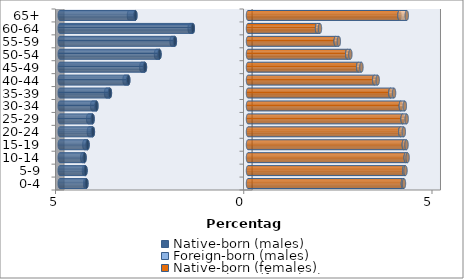
| Category | Native-born (males) | Foreign-born (males) | Native-born (females) | Foreign-born (females) |
|---|---|---|---|---|
| 0-4 | -4.292 | -0.033 | 4.115 | 0.028 |
| 5-9 | -4.316 | -0.041 | 4.15 | 0.033 |
| 10-14 | -4.342 | -0.061 | 4.189 | 0.05 |
| 15-19 | -4.262 | -0.085 | 4.139 | 0.071 |
| 20-24 | -4.12 | -0.106 | 4.045 | 0.094 |
| 25-29 | -4.128 | -0.118 | 4.107 | 0.108 |
| 30-34 | -4.027 | -0.113 | 4.06 | 0.107 |
| 35-39 | -3.668 | -0.101 | 3.782 | 0.097 |
| 40-44 | -3.18 | -0.098 | 3.353 | 0.092 |
| 45-49 | -2.737 | -0.096 | 2.926 | 0.087 |
| 50-54 | -2.351 | -0.091 | 2.635 | 0.084 |
| 55-59 | -1.942 | -0.086 | 2.33 | 0.083 |
| 60-64 | -1.466 | -0.084 | 1.834 | 0.077 |
| 65+ | -2.991 | -0.171 | 4.024 | 0.194 |